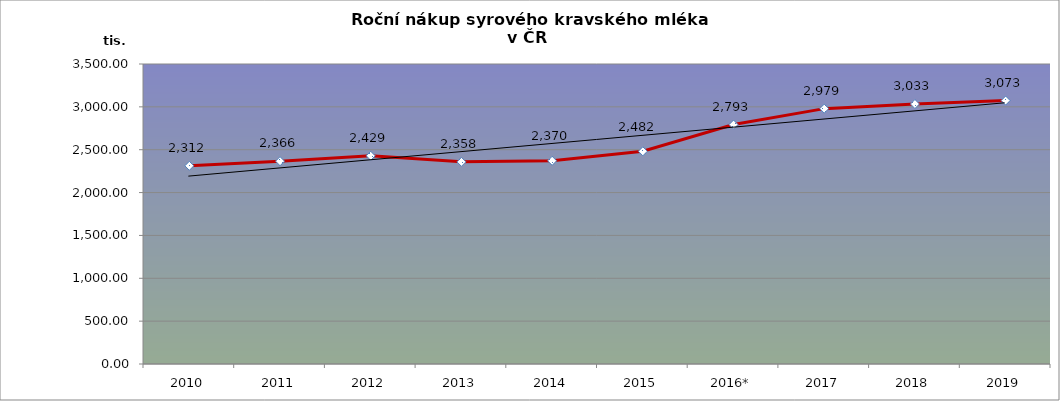
| Category | syrové kravské mléko                             v tis. tun |
|---|---|
| 2010 | 2312.226 |
| 2011 | 2366.104 |
| 2012 | 2428.774 |
| 2013 | 2358.416 |
| 2014 | 2370.204 |
| 2015 | 2481.55 |
| 2016* | 2793.2 |
| 2017 | 2979.336 |
| 2018 | 3033.02 |
| 2019 | 3073.492 |